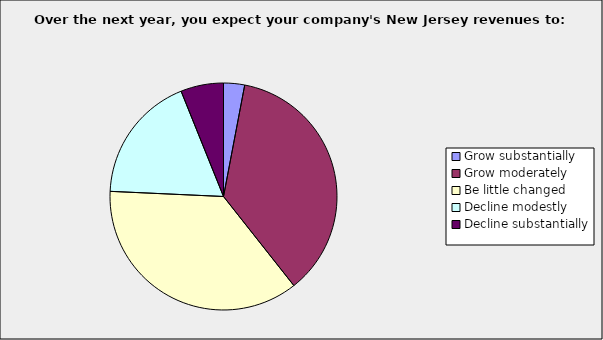
| Category | Series 0 |
|---|---|
| Grow substantially | 0.03 |
| Grow moderately | 0.364 |
| Be little changed | 0.364 |
| Decline modestly | 0.182 |
| Decline substantially | 0.061 |